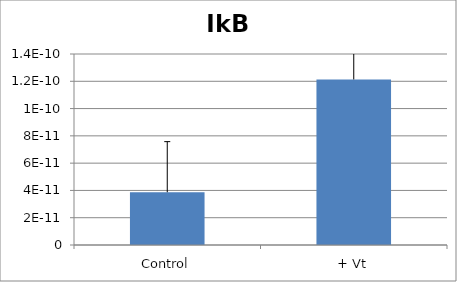
| Category | Series 0 |
|---|---|
| Control | 0 |
| + Vt | 0 |